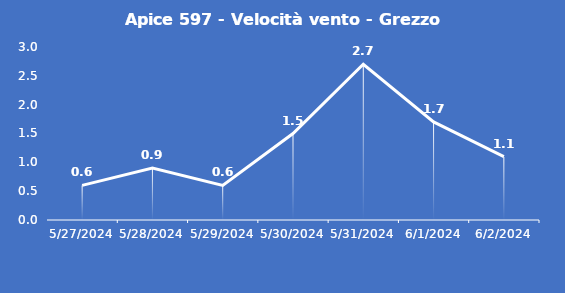
| Category | Apice 597 - Velocità vento - Grezzo (m/s) |
|---|---|
| 5/27/24 | 0.6 |
| 5/28/24 | 0.9 |
| 5/29/24 | 0.6 |
| 5/30/24 | 1.5 |
| 5/31/24 | 2.7 |
| 6/1/24 | 1.7 |
| 6/2/24 | 1.1 |